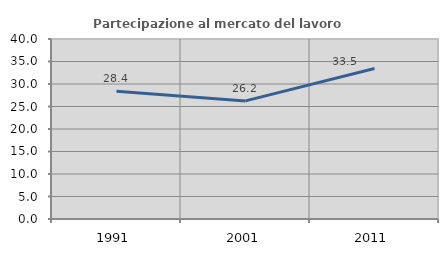
| Category | Partecipazione al mercato del lavoro  femminile |
|---|---|
| 1991.0 | 28.382 |
| 2001.0 | 26.247 |
| 2011.0 | 33.452 |